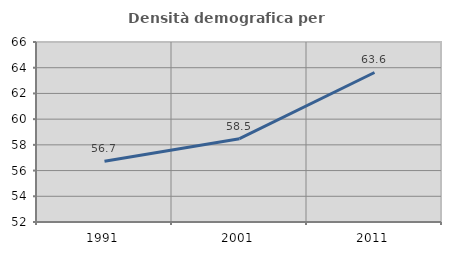
| Category | Densità demografica |
|---|---|
| 1991.0 | 56.72 |
| 2001.0 | 58.477 |
| 2011.0 | 63.629 |